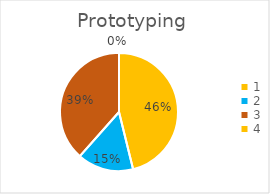
| Category | Series 0 |
|---|---|
| 0 | 0.462 |
| 1 | 0.154 |
| 2 | 0.385 |
| 3 | 0 |